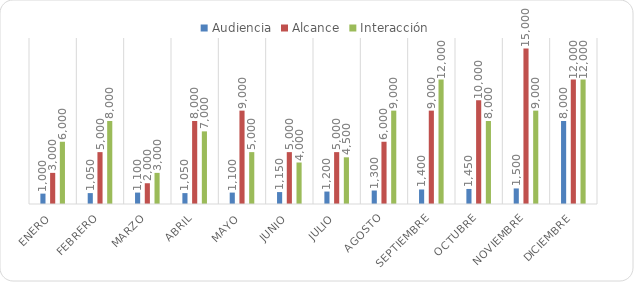
| Category | Audiencia | Alcance | Interacción |
|---|---|---|---|
| Enero | 1000 | 3000 | 6000 |
| Febrero | 1050 | 5000 | 8000 |
| Marzo | 1100 | 2000 | 3000 |
| Abril | 1050 | 8000 | 7000 |
| Mayo | 1100 | 9000 | 5000 |
| Junio | 1150 | 5000 | 4000 |
| Julio | 1200 | 5000 | 4500 |
| Agosto | 1300 | 6000 | 9000 |
| Septiembre | 1400 | 9000 | 12000 |
| Octubre | 1450 | 10000 | 8000 |
| Noviembre | 1500 | 15000 | 9000 |
| Diciembre | 8000 | 12000 | 12000 |